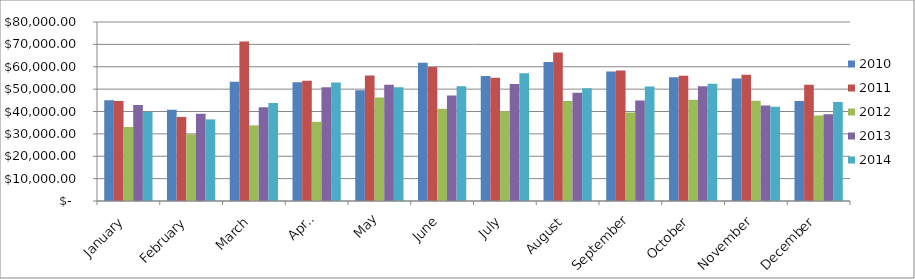
| Category | 2010 | 2011 | 2012 | 2013 | 2014 |
|---|---|---|---|---|---|
| January | 45018.04 | 44691.52 | 33082.98 | 42883.38 | 39938.56 |
| February | 40808.17 | 37586.6 | 29824.73 | 39020.47 | 36485.77 |
| March | 53265.54 | 71303.38 | 33809.05 | 41865.56 | 43838.29 |
| April | 53020.42 | 53757.52 | 35384.24 | 50886.24 | 52989.96 |
| May | 49500.98 | 56116.11 | 46232.26 | 51995.9 | 50884.53 |
| June | 61779.89 | 59880.78 | 41199.69 | 47124.4 | 51310.85 |
| July | 55849.8 | 55121.24 | 40084.98 | 52303.12 | 57127.1 |
| August | 62136.69 | 66327.72 | 44671.83 | 48375.57 | 50398.43 |
| September | 57881.58 | 58362.23 | 39546.61 | 44956.19 | 51226.28 |
| October | 55354.16 | 56027.38 | 45266.67 | 51332.45 | 52434.39 |
| November | 54767.58 | 56403.12 | 44751.13 | 42694.45 | 42107.51 |
| December | 44645.16 | 51914.82 | 38241.57 | 38741.03 | 44288.23 |